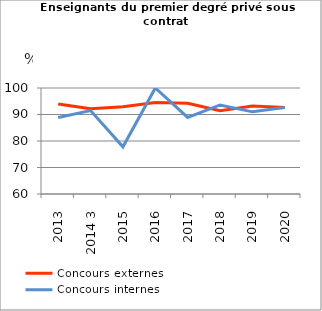
| Category | Concours externes  | Concours internes |
|---|---|---|
| 2013 | 94 | 88.9 |
| 2014 3 | 92.2 | 91.5 |
| 2015 | 92.9 | 77.8 |
| 2016 | 94.5 | 100 |
| 2017 | 94.2 | 88.9 |
| 2018 | 91.4 | 93.6 |
| 2019 | 93.2 | 91 |
| 2020 | 92.6 | 92.6 |